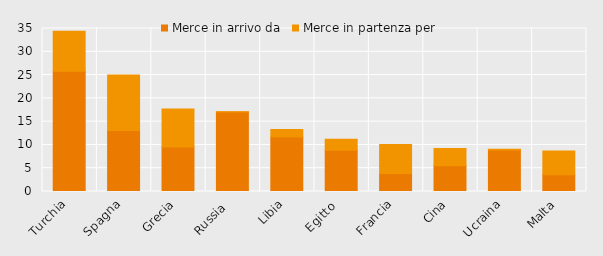
| Category | Merce in arrivo da | Merce in partenza per |
|---|---|---|
| Turchia | 25.847 | 8.545 |
| Spagna | 13.122 | 11.913 |
| Grecia | 9.556 | 8.172 |
| Russia  | 17.056 | 0.091 |
| Libia | 11.722 | 1.599 |
| Egitto  | 8.847 | 2.35 |
| Francia | 3.847 | 6.269 |
| Cina | 5.53 | 3.692 |
| Ucraina | 8.888 | 0.199 |
| Malta | 3.576 | 5.096 |